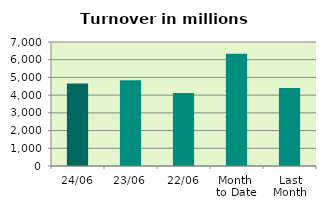
| Category | Series 0 |
|---|---|
| 24/06 | 4659.829 |
| 23/06 | 4835.693 |
| 22/06 | 4116.668 |
| Month 
to Date | 6339.582 |
| Last
Month | 4406.275 |